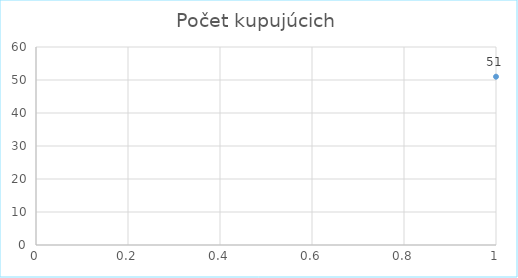
| Category | Series 0 |
|---|---|
| 0 | 51 |
| 1 | 0 |
| 2 | 0 |
| 3 | 0 |
| 4 | 0 |
| 5 | 0 |
| 6 | 0 |
| 7 | 0 |
| 8 | 0 |
| 9 | 0 |
| 10 | 0 |
| 11 | 0 |